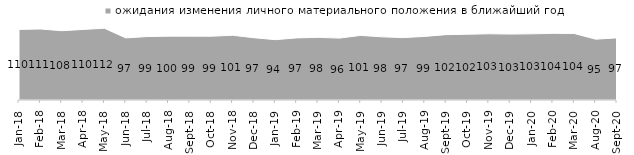
| Category | ожидания изменения личного материального положения в ближайший год |
|---|---|
| 2018-01-01 | 110.05 |
| 2018-02-01 | 110.65 |
| 2018-03-01 | 108 |
| 2018-04-01 | 109.95 |
| 2018-05-01 | 111.8 |
| 2018-06-01 | 96.75 |
| 2018-07-01 | 98.85 |
| 2018-08-01 | 99.5 |
| 2018-09-01 | 99.45 |
| 2018-10-01 | 99.4 |
| 2018-11-01 | 100.848 |
| 2018-12-01 | 97.05 |
| 2019-01-01 | 94.05 |
| 2019-02-01 | 96.75 |
| 2019-03-01 | 97.663 |
| 2019-04-01 | 96.436 |
| 2019-05-01 | 100.693 |
| 2019-06-01 | 98.404 |
| 2019-07-01 | 97.228 |
| 2019-08-01 | 99.151 |
| 2019-09-01 | 101.881 |
| 2019-10-01 | 102.475 |
| 2019-11-01 | 103.218 |
| 2019-12-01 | 102.772 |
| 2020-01-01 | 103.119 |
| 2020-02-01 | 103.861 |
| 2020-03-01 | 103.619 |
| 2020-08-01 | 94.786 |
| 2020-09-01 | 96.864 |